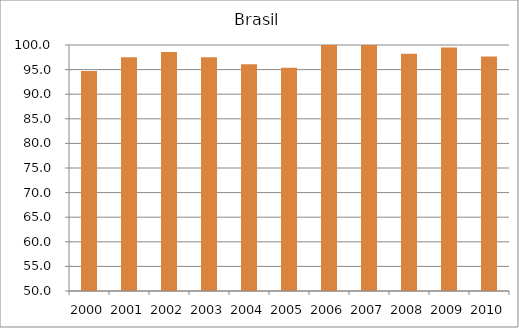
| Category | Brasil |
|---|---|
| 2000.0 | 94.7 |
| 2001.0 | 97.5 |
| 2002.0 | 98.6 |
| 2003.0 | 97.5 |
| 2004.0 | 96.1 |
| 2005.0 | 95.4 |
| 2006.0 | 100.5 |
| 2007.0 | 103.1 |
| 2008.0 | 98.2 |
| 2009.0 | 99.5 |
| 2010.0 | 97.66 |